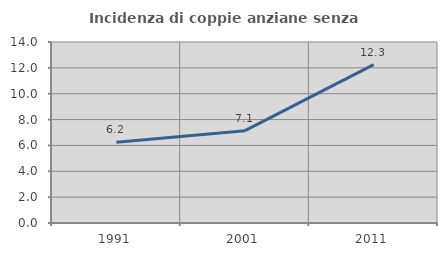
| Category | Incidenza di coppie anziane senza figli  |
|---|---|
| 1991.0 | 6.24 |
| 2001.0 | 7.143 |
| 2011.0 | 12.255 |